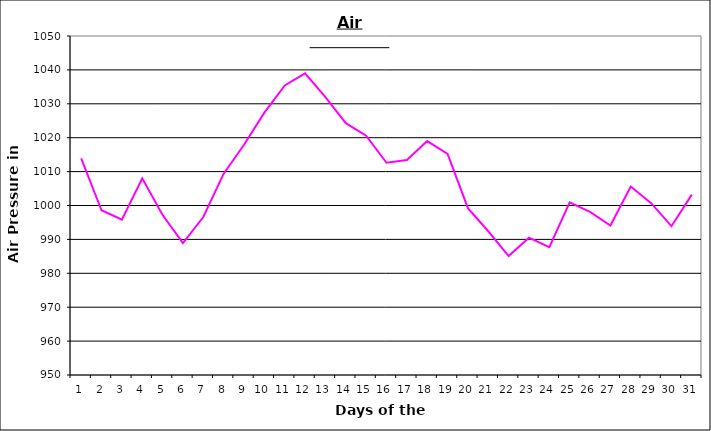
| Category | Series 0 |
|---|---|
| 0 | 1013.9 |
| 1 | 998.6 |
| 2 | 995.8 |
| 3 | 1008 |
| 4 | 997.2 |
| 5 | 988.9 |
| 6 | 996.6 |
| 7 | 1009.4 |
| 8 | 1017.9 |
| 9 | 1027.4 |
| 10 | 1035.4 |
| 11 | 1039 |
| 12 | 1032 |
| 13 | 1024.3 |
| 14 | 1020.6 |
| 15 | 1012.6 |
| 16 | 1013.4 |
| 17 | 1019 |
| 18 | 1015.2 |
| 19 | 999.2 |
| 20 | 992.4 |
| 21 | 985.1 |
| 22 | 990.5 |
| 23 | 987.7 |
| 24 | 1000.9 |
| 25 | 998.1 |
| 26 | 994.1 |
| 27 | 1005.6 |
| 28 | 1000.7 |
| 29 | 993.9 |
| 30 | 1003.2 |